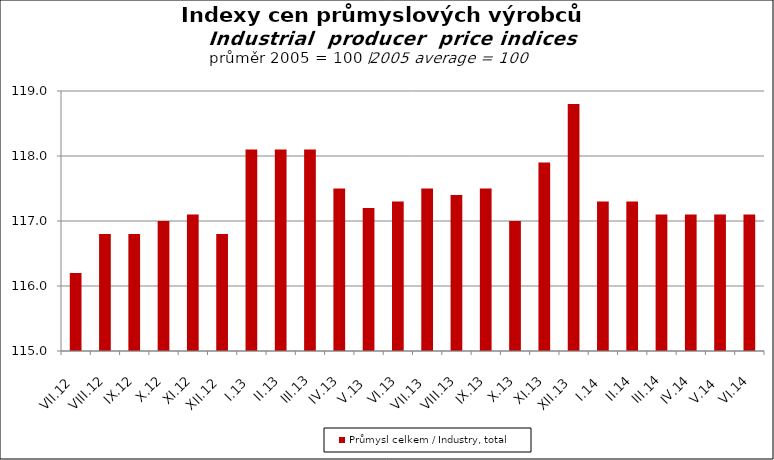
| Category | Průmysl celkem / Industry, total |
|---|---|
| VII.12 | 116.2 |
| VIII.12 | 116.8 |
| IX.12 | 116.8 |
| X.12 | 117 |
| XI.12 | 117.1 |
| XII.12 | 116.8 |
| I.13 | 118.1 |
| II.13 | 118.1 |
| III.13 | 118.1 |
| IV.13 | 117.5 |
| V.13 | 117.2 |
| VI.13 | 117.3 |
| VII.13 | 117.5 |
| VIII.13 | 117.4 |
| IX.13 | 117.5 |
| X.13 | 117 |
| XI.13 | 117.9 |
| XII.13 | 118.8 |
| I.14 | 117.3 |
| II.14 | 117.3 |
| III.14 | 117.1 |
| IV.14 | 117.1 |
| V.14 | 117.1 |
| VI.14 | 117.1 |